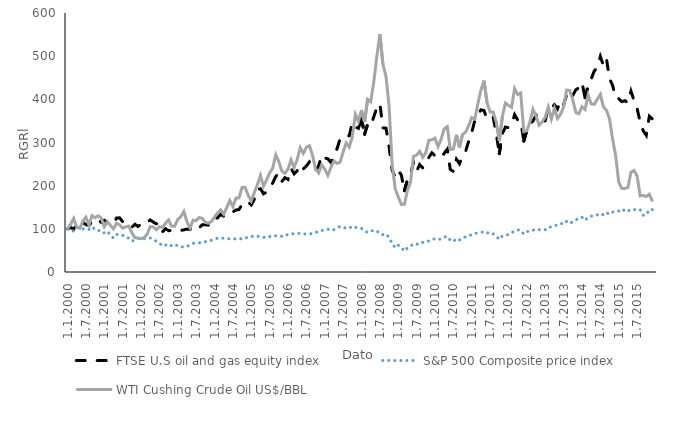
| Category | FTSE U.S oil and gas equity index | S&P 500 Composite price index | WTI Cushing Crude Oil US$/BBL |
|---|---|---|---|
| 1.1.2000 | 100 | 100 | 100 |
| 1.2.2000 | 103.217 | 96.843 | 110.273 |
| 1.3.2000 | 99.239 | 94.775 | 124.141 |
| 1.4.2000 | 109.791 | 103.487 | 103.242 |
| 1.5.2000 | 106.812 | 100.895 | 101.094 |
| 1.6.2000 | 114.614 | 99.56 | 117.695 |
| 1.7.2000 | 109.828 | 100.984 | 126.953 |
| 1.8.2000 | 107.723 | 98.824 | 108.516 |
| 1.9.2000 | 116.673 | 104.504 | 130.391 |
| 1.10.2000 | 122.759 | 98.695 | 125.703 |
| 1.11.2000 | 120.904 | 97.664 | 130 |
| 1.12.2000 | 114.972 | 90.38 | 125.195 |
| 1.1.2001 | 119.963 | 90.727 | 104.805 |
| 1.2.2001 | 115.305 | 94.382 | 116.523 |
| 1.3.2001 | 114.973 | 85.295 | 107.93 |
| 1.4.2001 | 110.53 | 78.742 | 99.922 |
| 1.5.2001 | 125.094 | 87.027 | 113.008 |
| 1.6.2001 | 125.443 | 86.631 | 109.102 |
| 1.7.2001 | 116.662 | 84.984 | 101.367 |
| 1.8.2001 | 114.194 | 83.556 | 104.609 |
| 1.9.2001 | 110.678 | 77.898 | 106.367 |
| 1.10.2001 | 103.674 | 71.367 | 90.938 |
| 1.11.2001 | 110.57 | 74.497 | 79.609 |
| 1.12.2001 | 105.509 | 77.645 | 78.438 |
| 1.1.2002 | 110.632 | 78.894 | 77.266 |
| 1.2.2002 | 108.429 | 77.115 | 79.609 |
| 1.3.2002 | 114.599 | 77.774 | 87.5 |
| 1.4.2002 | 120.687 | 78.788 | 105 |
| 1.5.2002 | 115.787 | 74.66 | 104.492 |
| 1.6.2002 | 111.503 | 71.514 | 97.969 |
| 1.7.2002 | 112.475 | 66.564 | 104.805 |
| 1.8.2002 | 93.181 | 60.792 | 103.438 |
| 1.9.2002 | 100.291 | 62.951 | 113.203 |
| 1.10.2002 | 95.791 | 58.267 | 120.43 |
| 1.11.2002 | 96.315 | 61.912 | 105.977 |
| 1.12.2002 | 97.441 | 64.219 | 106.367 |
| 1.1.2003 | 97.786 | 60.46 | 121.992 |
| 1.2.2003 | 96.282 | 59.12 | 128.047 |
| 1.3.2003 | 97.622 | 57.367 | 140.156 |
| 1.4.2003 | 99.54 | 58.993 | 116.328 |
| 1.5.2003 | 98.075 | 62.966 | 101.68 |
| 1.6.2003 | 106.748 | 66.45 | 120.039 |
| 1.7.2003 | 105.756 | 67.503 | 118.867 |
| 1.8.2003 | 102.598 | 67.354 | 126.289 |
| 1.9.2003 | 109.655 | 69.269 | 124.141 |
| 1.10.2003 | 109.404 | 69.97 | 114.766 |
| 1.11.2003 | 108.467 | 72.774 | 113.008 |
| 1.12.2003 | 110.878 | 73.537 | 117.109 |
| 1.1.2004 | 124.103 | 76.409 | 127.148 |
| 1.2.2004 | 125.239 | 78.013 | 136.641 |
| 1.3.2004 | 133.358 | 79.435 | 144.062 |
| 1.4.2004 | 129.215 | 77.801 | 133.906 |
| 1.5.2004 | 134.819 | 76.792 | 149.336 |
| 1.6.2004 | 133.597 | 77.047 | 165.43 |
| 1.7.2004 | 139.226 | 77.579 | 151.289 |
| 1.8.2004 | 143.661 | 76.045 | 171.211 |
| 1.9.2004 | 144.724 | 75.996 | 171.914 |
| 1.10.2004 | 156.61 | 77.755 | 195.82 |
| 1.11.2004 | 154.407 | 77.687 | 195.859 |
| 1.12.2004 | 161.564 | 81.869 | 177.695 |
| 1.1.2005 | 155.423 | 82.605 | 164.57 |
| 1.2.2005 | 168.337 | 81.734 | 184.102 |
| 1.3.2005 | 191.133 | 83.177 | 201.914 |
| 1.4.2005 | 192.909 | 80.601 | 223.75 |
| 1.5.2005 | 181.258 | 79.861 | 198.945 |
| 1.6.2005 | 184.977 | 82.618 | 213.32 |
| 1.7.2005 | 196.202 | 82.08 | 229.531 |
| 1.8.2005 | 206.165 | 84.891 | 240.547 |
| 1.9.2005 | 221.366 | 83.945 | 271.406 |
| 1.10.2005 | 228.546 | 84.297 | 255.781 |
| 1.11.2005 | 209.791 | 82.651 | 233.828 |
| 1.12.2005 | 218.53 | 86.906 | 228.438 |
| 1.1.2006 | 214.455 | 85.78 | 238.438 |
| 1.2.2006 | 239.633 | 88.128 | 260.039 |
| 1.3.2006 | 227.538 | 88.732 | 242.109 |
| 1.4.2006 | 234.537 | 89.183 | 260.742 |
| 1.5.2006 | 248.429 | 89.69 | 287.93 |
| 1.6.2006 | 238.843 | 88.352 | 274.766 |
| 1.7.2006 | 245.709 | 87.972 | 288.789 |
| 1.8.2006 | 255.034 | 87.335 | 292.656 |
| 1.9.2006 | 246.979 | 90.09 | 270.312 |
| 1.10.2006 | 234.607 | 91.486 | 238.438 |
| 1.11.2006 | 245.973 | 93.993 | 229.375 |
| 1.12.2006 | 270.599 | 95.979 | 247.812 |
| 1.1.2007 | 263.985 | 97.463 | 238.516 |
| 1.2.2007 | 262.253 | 99.362 | 223.867 |
| 1.3.2007 | 253.923 | 96.423 | 242.227 |
| 1.4.2007 | 273.426 | 97.892 | 257.617 |
| 1.5.2007 | 285.386 | 102.136 | 251.602 |
| 1.6.2007 | 308.033 | 105.574 | 254.258 |
| 1.7.2007 | 314.726 | 104.412 | 277.734 |
| 1.8.2007 | 313.234 | 100.728 | 298.984 |
| 1.9.2007 | 315.736 | 101.29 | 289.258 |
| 1.10.2007 | 346.044 | 106.309 | 313.477 |
| 1.11.2007 | 335.729 | 103.657 | 365.195 |
| 1.12.2007 | 332.821 | 101.182 | 348.906 |
| 1.1.2008 | 355.883 | 100.902 | 375.039 |
| 1.2.2008 | 319.045 | 95.891 | 347.539 |
| 1.3.2008 | 342.328 | 91.487 | 400.234 |
| 1.4.2008 | 338.266 | 94.156 | 394.453 |
| 1.5.2008 | 359.501 | 96.847 | 439.531 |
| 1.6.2008 | 379.643 | 95.221 | 499.062 |
| 1.7.2008 | 390.189 | 88.297 | 550.664 |
| 1.8.2008 | 333.914 | 86.606 | 481.484 |
| 1.9.2008 | 333.272 | 88.154 | 452.969 |
| 1.10.2008 | 290.141 | 79.786 | 384.883 |
| 1.11.2008 | 235.995 | 66.402 | 249.648 |
| 1.12.2008 | 219.446 | 56.088 | 192.5 |
| 1.1.2009 | 234.368 | 62.07 | 174.219 |
| 1.2.2009 | 225.221 | 56.723 | 156.562 |
| 1.3.2009 | 188.37 | 48.159 | 156.836 |
| 1.4.2009 | 212.981 | 55.736 | 189.023 |
| 1.5.2009 | 227.017 | 60.302 | 207.812 |
| 1.6.2009 | 254.148 | 64.792 | 267.891 |
| 1.7.2009 | 233.584 | 63.45 | 270.742 |
| 1.8.2009 | 248.818 | 68.899 | 279.609 |
| 1.9.2009 | 241.228 | 68.583 | 265.82 |
| 1.10.2009 | 249.791 | 70.769 | 276.641 |
| 1.11.2009 | 265.514 | 71.665 | 305.195 |
| 1.12.2009 | 276.082 | 76.199 | 306.133 |
| 1.1.2010 | 269.274 | 76.628 | 310 |
| 1.2.2010 | 265.001 | 74.847 | 290.742 |
| 1.3.2010 | 264.623 | 76.67 | 307.422 |
| 1.4.2010 | 274.764 | 80.957 | 331.523 |
| 1.5.2010 | 284.356 | 82.617 | 336.68 |
| 1.6.2010 | 237.417 | 73.577 | 283.516 |
| 1.7.2010 | 233.049 | 70.599 | 284.961 |
| 1.8.2010 | 261.252 | 77.367 | 317.734 |
| 1.9.2010 | 250.944 | 74.236 | 288.711 |
| 1.10.2010 | 268.403 | 78.767 | 318.672 |
| 1.11.2010 | 280.086 | 81.388 | 324.023 |
| 1.12.2010 | 302.893 | 82.879 | 338.867 |
| 1.1.2011 | 323.492 | 87.401 | 357.617 |
| 1.2.2011 | 350.825 | 89.855 | 354.57 |
| 1.3.2011 | 363.626 | 89.769 | 389.18 |
| 1.4.2011 | 375.688 | 91.561 | 421.641 |
| 1.5.2011 | 374.11 | 93.54 | 443.437 |
| 1.6.2011 | 354.211 | 90.333 | 391.758 |
| 1.7.2011 | 359.261 | 92.06 | 370.859 |
| 1.8.2011 | 359.072 | 88.436 | 370.664 |
| 1.9.2011 | 320.821 | 82.765 | 347.383 |
| 1.10.2011 | 273.963 | 75.537 | 303.164 |
| 1.11.2011 | 320.526 | 83.718 | 360.117 |
| 1.12.2011 | 335.602 | 85.525 | 391.406 |
| 1.1.2012 | 334.511 | 86.42 | 386.055 |
| 1.2.2012 | 341.797 | 90.989 | 381.289 |
| 1.3.2012 | 364.48 | 94.425 | 424.844 |
| 1.4.2012 | 352.192 | 97.514 | 411.055 |
| 1.5.2012 | 349.956 | 96.605 | 414.687 |
| 1.6.2012 | 303.184 | 87.825 | 325.117 |
| 1.7.2012 | 327.795 | 93.835 | 327.148 |
| 1.8.2012 | 343.69 | 94.497 | 347.305 |
| 1.9.2012 | 349.571 | 96.658 | 376.836 |
| 1.10.2012 | 363.641 | 99.263 | 361.25 |
| 1.11.2012 | 355.569 | 98.101 | 340.195 |
| 1.12.2012 | 346.321 | 96.855 | 348.008 |
| 1.1.2013 | 350.713 | 98.005 | 358.672 |
| 1.2.2013 | 382.084 | 103.982 | 381.914 |
| 1.3.2013 | 379.089 | 104.328 | 354.219 |
| 1.4.2013 | 387.52 | 107.349 | 379.18 |
| 1.5.2013 | 377.881 | 108.76 | 355.586 |
| 1.6.2013 | 397.577 | 112.727 | 365.039 |
| 1.7.2013 | 387.624 | 110.977 | 382.383 |
| 1.8.2013 | 410.352 | 117.293 | 421.562 |
| 1.9.2013 | 399.146 | 112.215 | 420.508 |
| 1.10.2013 | 409.137 | 116.477 | 398.75 |
| 1.11.2013 | 422.147 | 121.057 | 369.57 |
| 1.12.2013 | 426.526 | 123.754 | 366.484 |
| 1.1.2014 | 439.138 | 127.016 | 382.969 |
| 1.2.2014 | 403.8 | 119.699 | 376.68 |
| 1.3.2014 | 431.058 | 126.835 | 409.844 |
| 1.4.2014 | 447.162 | 129.569 | 389.609 |
| 1.5.2014 | 465.654 | 129.443 | 388.359 |
| 1.6.2014 | 473.483 | 132.28 | 400.273 |
| 1.7.2014 | 499.274 | 135.603 | 411.484 |
| 1.8.2014 | 478.449 | 132.293 | 382.344 |
| 1.9.2014 | 493.863 | 137.668 | 374.844 |
| 1.10.2014 | 447.34 | 133.736 | 354.414 |
| 1.11.2014 | 432.544 | 138.66 | 307.734 |
| 1.12.2014 | 402.843 | 141.109 | 269.531 |
| 1.1.2015 | 401.461 | 141.484 | 208.086 |
| 1.2.2015 | 394.627 | 138.869 | 193.633 |
| 1.3.2015 | 396.884 | 145.503 | 193.711 |
| 1.4.2015 | 392.414 | 141.538 | 195.664 |
| 1.5.2015 | 418.851 | 144.878 | 231.055 |
| 1.6.2015 | 397.096 | 145.114 | 235.156 |
| 1.7.2015 | 379.234 | 142.756 | 222.5 |
| 1.8.2015 | 347.197 | 144.173 | 176.445 |
| 1.9.2015 | 327.373 | 131.516 | 177.383 |
| 1.10.2015 | 316.528 | 132.201 | 174.766 |
| 1.11.2015 | 360.867 | 144.586 | 180.234 |
| 1.12.2015 | 354.48 | 144.489 | 163.477 |